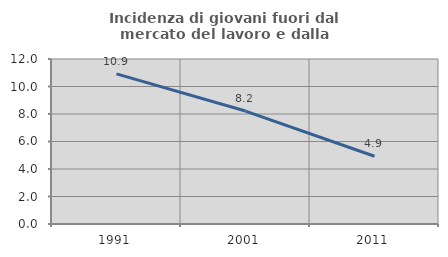
| Category | Incidenza di giovani fuori dal mercato del lavoro e dalla formazione  |
|---|---|
| 1991.0 | 10.918 |
| 2001.0 | 8.214 |
| 2011.0 | 4.93 |